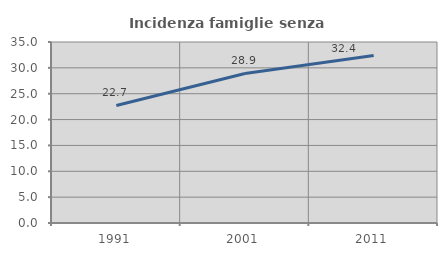
| Category | Incidenza famiglie senza nuclei |
|---|---|
| 1991.0 | 22.732 |
| 2001.0 | 28.917 |
| 2011.0 | 32.398 |